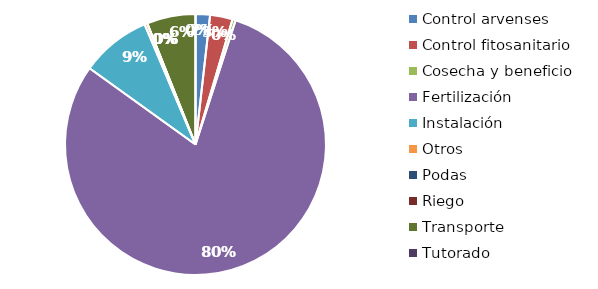
| Category | Valor |
|---|---|
| Control arvenses | 835380 |
| Control fitosanitario | 1303340 |
| Cosecha y beneficio | 182759.745 |
| Fertilización | 37337976 |
| Instalación | 4058810.153 |
| Otros | 163200 |
| Podas | 0 |
| Riego | 0 |
| Transporte | 2817550 |
| Tutorado | 0 |